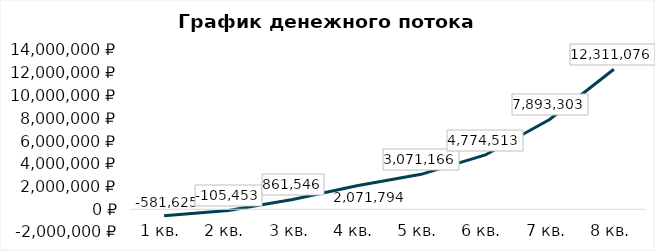
| Category | Денежный поток |
|---|---|
| 1 кв. | -581625.123 |
| 2 кв. | -105452.696 |
| 3 кв. | 861546.149 |
| 4 кв. | 2071794.41 |
| 5 кв. | 3071166.006 |
| 6 кв. | 4774513.24 |
| 7 кв. | 7893302.97 |
| 8 кв. | 12311075.527 |